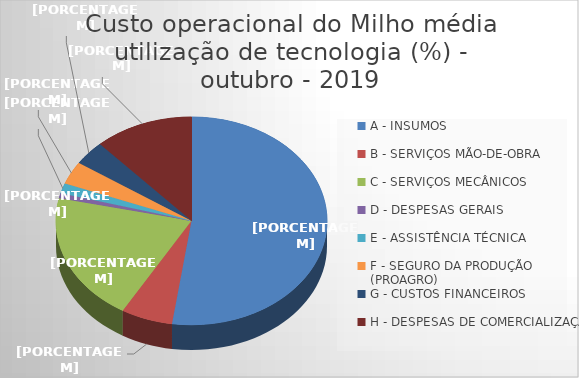
| Category | Series 0 |
|---|---|
| A - INSUMOS | 52.299 |
| B - SERVIÇOS MÃO-DE-OBRA | 6.156 |
| C - SERVIÇOS MECÂNICOS | 20.028 |
| D - DESPESAS GERAIS  | 0.785 |
| E - ASSISTÊNCIA TÉCNICA | 1.585 |
| F - SEGURO DA PRODUÇÃO (PROAGRO) | 3.567 |
| G - CUSTOS FINANCEIROS | 3.799 |
| H - DESPESAS DE COMERCIALIZAÇÃO | 11.781 |